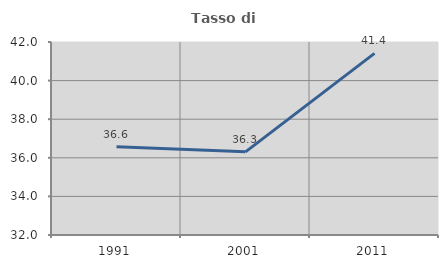
| Category | Tasso di occupazione   |
|---|---|
| 1991.0 | 36.579 |
| 2001.0 | 36.308 |
| 2011.0 | 41.409 |